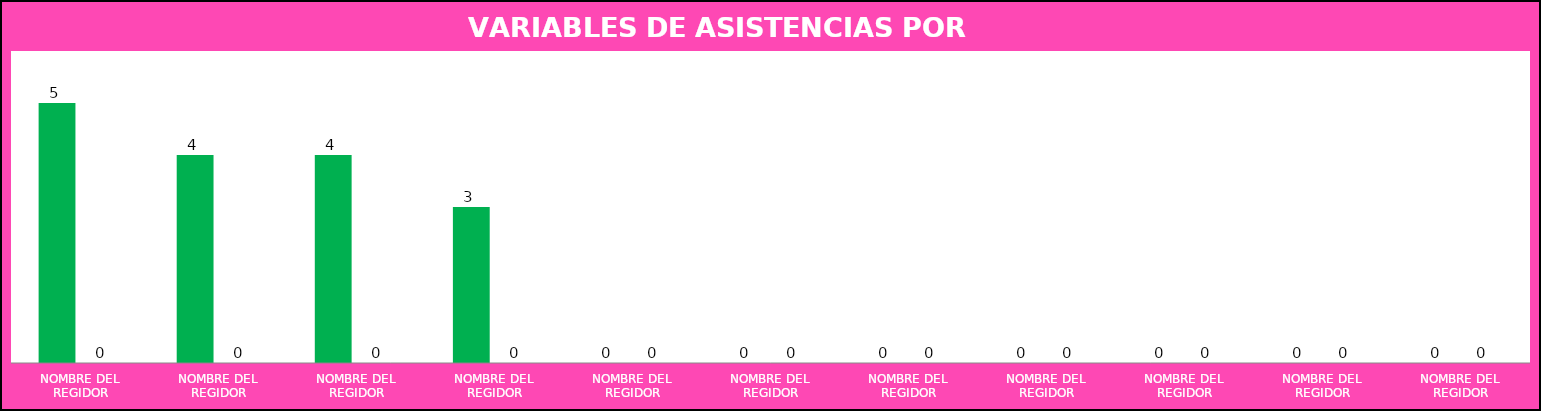
| Category | Series 0 | Series 1 |
|---|---|---|
| NOMBRE DEL REGIDOR | 5 | 0 |
| NOMBRE DEL REGIDOR | 4 | 0 |
| NOMBRE DEL REGIDOR | 4 | 0 |
| NOMBRE DEL REGIDOR | 3 | 0 |
| NOMBRE DEL REGIDOR | 0 | 0 |
| NOMBRE DEL REGIDOR | 0 | 0 |
| NOMBRE DEL REGIDOR | 0 | 0 |
| NOMBRE DEL REGIDOR | 0 | 0 |
| NOMBRE DEL REGIDOR | 0 | 0 |
| NOMBRE DEL REGIDOR | 0 | 0 |
| NOMBRE DEL REGIDOR | 0 | 0 |